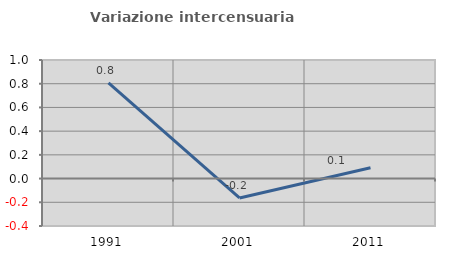
| Category | Variazione intercensuaria annua |
|---|---|
| 1991.0 | 0.807 |
| 2001.0 | -0.163 |
| 2011.0 | 0.092 |